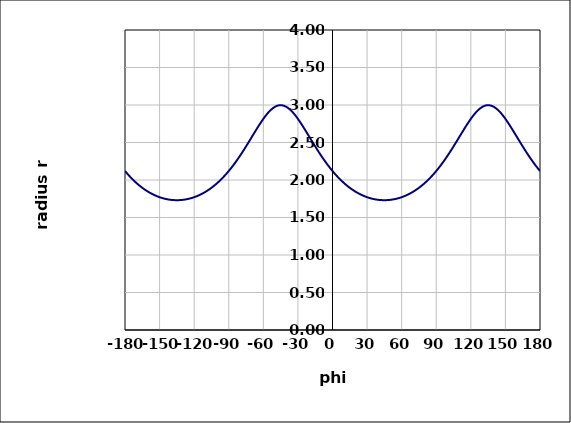
| Category | Series 0 |
|---|---|
| -180.0 | 2.12 |
| -176.0 | 2.05 |
| -172.0 | 1.987 |
| -168.0 | 1.932 |
| -164.0 | 1.885 |
| -160.0 | 1.844 |
| -156.0 | 1.81 |
| -152.0 | 1.782 |
| -148.0 | 1.761 |
| -144.0 | 1.745 |
| -140.0 | 1.735 |
| -136.0 | 1.731 |
| -132.0 | 1.732 |
| -128.0 | 1.739 |
| -124.0 | 1.752 |
| -120.0 | 1.771 |
| -116.0 | 1.795 |
| -112.0 | 1.826 |
| -108.0 | 1.864 |
| -104.0 | 1.908 |
| -100.0 | 1.959 |
| -96.0 | 2.018 |
| -92.0 | 2.084 |
| -88.0 | 2.158 |
| -84.0 | 2.239 |
| -80.0 | 2.328 |
| -76.0 | 2.423 |
| -72.0 | 2.523 |
| -68.0 | 2.624 |
| -64.0 | 2.723 |
| -60.0 | 2.815 |
| -56.0 | 2.894 |
| -52.0 | 2.954 |
| -48.0 | 2.99 |
| -44.0 | 2.997 |
| -40.0 | 2.975 |
| -36.0 | 2.927 |
| -32.0 | 2.857 |
| -28.0 | 2.77 |
| -24.0 | 2.674 |
| -20.0 | 2.573 |
| -16.0 | 2.473 |
| -12.0 | 2.375 |
| -8.0 | 2.283 |
| -4.0 | 2.198 |
| 0.0 | 2.12 |
| 4.0 | 2.05 |
| 8.0 | 1.987 |
| 12.0 | 1.932 |
| 16.0 | 1.885 |
| 20.0 | 1.844 |
| 24.0 | 1.81 |
| 28.0 | 1.782 |
| 32.0 | 1.761 |
| 36.0 | 1.745 |
| 40.0 | 1.735 |
| 44.0 | 1.731 |
| 48.0 | 1.732 |
| 52.0 | 1.739 |
| 56.0 | 1.752 |
| 60.0 | 1.771 |
| 64.0 | 1.795 |
| 68.0 | 1.826 |
| 72.0 | 1.864 |
| 76.0 | 1.908 |
| 80.0 | 1.959 |
| 84.0 | 2.018 |
| 88.0 | 2.084 |
| 92.0 | 2.158 |
| 96.0 | 2.239 |
| 100.0 | 2.328 |
| 104.0 | 2.423 |
| 108.0 | 2.523 |
| 112.0 | 2.624 |
| 116.0 | 2.723 |
| 120.0 | 2.815 |
| 124.0 | 2.894 |
| 128.0 | 2.954 |
| 132.0 | 2.99 |
| 136.0 | 2.997 |
| 140.0 | 2.975 |
| 144.0 | 2.927 |
| 148.0 | 2.857 |
| 152.0 | 2.77 |
| 156.0 | 2.674 |
| 160.0 | 2.573 |
| 164.0 | 2.473 |
| 168.0 | 2.375 |
| 172.0 | 2.283 |
| 176.0 | 2.198 |
| 180.0 | 2.12 |